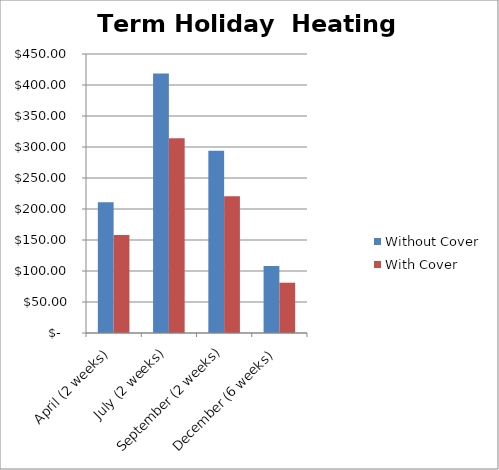
| Category | Without Cover | With Cover |
|---|---|---|
| April (2 weeks) | 210.712 | 158.034 |
| July (2 weeks) | 418.652 | 313.989 |
| September (2 weeks) | 293.888 | 220.416 |
| December (6 weeks) | 108.129 | 81.097 |